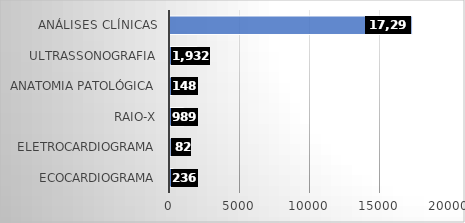
| Category | Series 0 |
|---|---|
| ECOCARDIOGRAMA | 236 |
| ELETROCARDIOGRAMA | 82 |
| RAIO-X | 989 |
| ANATOMIA PATOLÓGICA | 148 |
| ULTRASSONOGRAFIA | 1932 |
| ANÁLISES CLÍNICAS | 17294 |